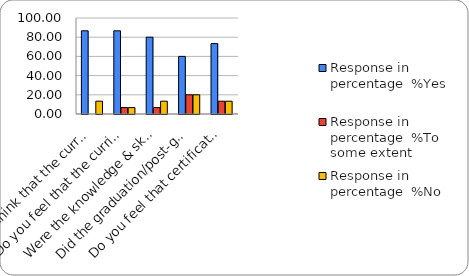
| Category | Response in percentage  |
|---|---|
| Do you think that the curriculum which you had during your graduation/post graduation has provided you with the knowledge & skills necessary to get employed/Self-employed or start own business? | 13.333 |
| Do you feel that the curriculum you studied is helpful in progression to higher studies? | 6.667 |
| Were the knowledge & skills acquired through the curriculum useful to you while working on the job?   | 13.333 |
| Did the graduation/post-graduation programme bring about any attitudinal and behavioural change in you? | 20 |
| Do you feel that certificate/ diploma courses offered by the college in addition to the curriculum lead to better career prospects? | 13.333 |